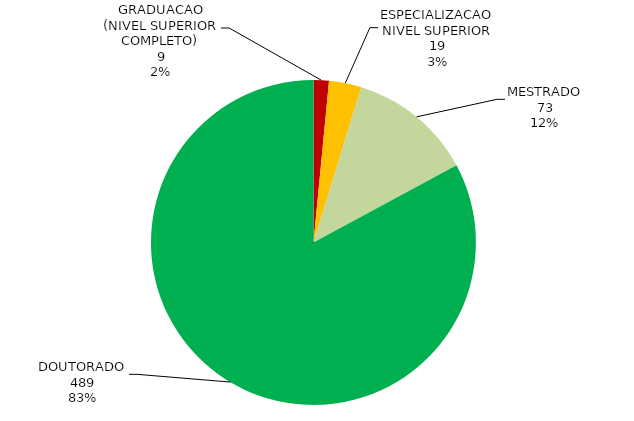
| Category | Total geral |
|---|---|
| GRADUACAO (NIVEL SUPERIOR COMPLETO) | 9 |
| ESPECIALIZACAO NIVEL SUPERIOR | 19 |
| MESTRADO | 73 |
| DOUTORADO | 489 |